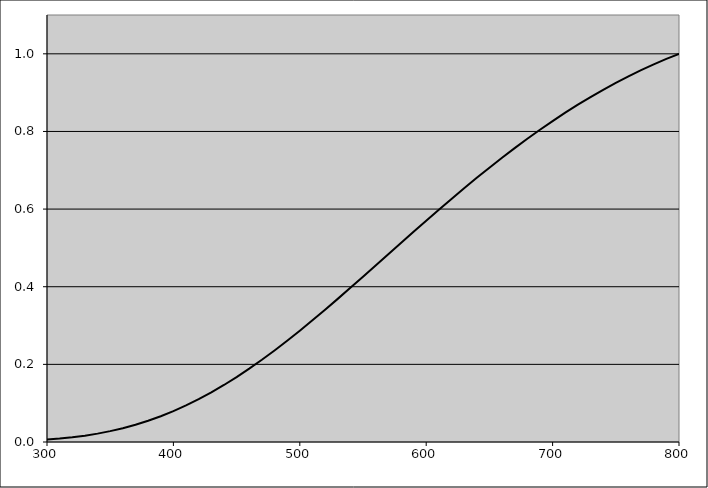
| Category | 3000 |
|---|---|
| 300.0 | 0.006 |
| 310.0 | 0.009 |
| 320.0 | 0.012 |
| 330.0 | 0.016 |
| 340.0 | 0.022 |
| 350.0 | 0.028 |
| 360.0 | 0.036 |
| 370.0 | 0.044 |
| 380.0 | 0.055 |
| 390.0 | 0.066 |
| 400.0 | 0.08 |
| 410.0 | 0.094 |
| 420.0 | 0.11 |
| 430.0 | 0.128 |
| 440.0 | 0.147 |
| 450.0 | 0.167 |
| 460.0 | 0.189 |
| 470.0 | 0.212 |
| 480.0 | 0.236 |
| 490.0 | 0.261 |
| 500.0 | 0.287 |
| 510.0 | 0.313 |
| 520.0 | 0.341 |
| 530.0 | 0.369 |
| 540.0 | 0.397 |
| 550.0 | 0.426 |
| 560.0 | 0.455 |
| 570.0 | 0.484 |
| 580.0 | 0.513 |
| 590.0 | 0.541 |
| 600.0 | 0.57 |
| 610.0 | 0.598 |
| 620.0 | 0.626 |
| 630.0 | 0.654 |
| 640.0 | 0.68 |
| 650.0 | 0.707 |
| 660.0 | 0.732 |
| 670.0 | 0.757 |
| 680.0 | 0.781 |
| 690.0 | 0.804 |
| 700.0 | 0.827 |
| 710.0 | 0.848 |
| 720.0 | 0.869 |
| 730.0 | 0.889 |
| 740.0 | 0.907 |
| 750.0 | 0.925 |
| 760.0 | 0.942 |
| 770.0 | 0.958 |
| 780.0 | 0.973 |
| 790.0 | 0.987 |
| 800.0 | 1 |